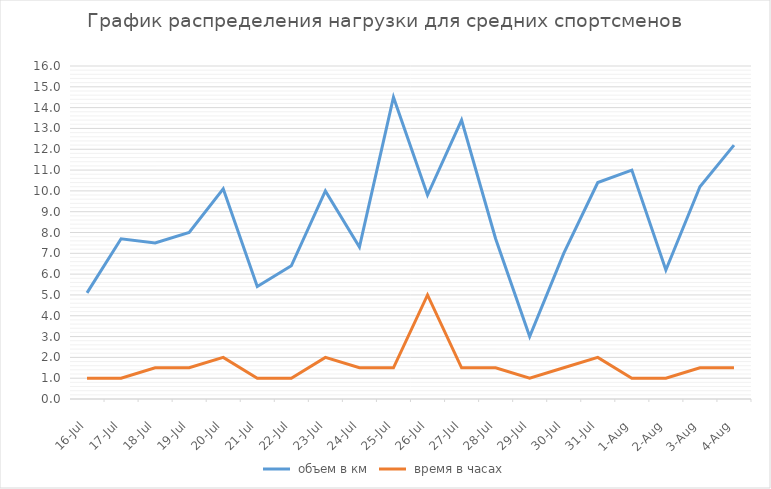
| Category |  объем в км |  время в часах |
|---|---|---|
| 2016-07-16 | 5.1 | 1 |
| 2016-07-17 | 7.7 | 1 |
| 2016-07-18 | 7.5 | 1.5 |
| 2016-07-19 | 8 | 1.5 |
| 2016-07-20 | 10.1 | 2 |
| 2016-07-21 | 5.4 | 1 |
| 2016-07-22 | 6.4 | 1 |
| 2016-07-23 | 10 | 2 |
| 2016-07-24 | 7.3 | 1.5 |
| 2016-07-25 | 14.5 | 1.5 |
| 2016-07-26 | 9.8 | 5 |
| 2016-07-27 | 13.4 | 1.5 |
| 2016-07-28 | 7.7 | 1.5 |
| 2016-07-29 | 3 | 1 |
| 2016-07-30 | 7 | 1.5 |
| 2016-07-31 | 10.4 | 2 |
| 2016-08-01 | 11 | 1 |
| 2016-08-02 | 6.2 | 1 |
| 2016-08-03 | 10.2 | 1.5 |
| 2016-08-04 | 12.2 | 1.5 |